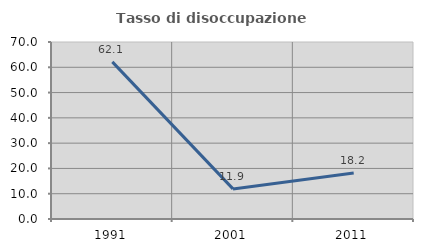
| Category | Tasso di disoccupazione giovanile  |
|---|---|
| 1991.0 | 62.136 |
| 2001.0 | 11.905 |
| 2011.0 | 18.182 |